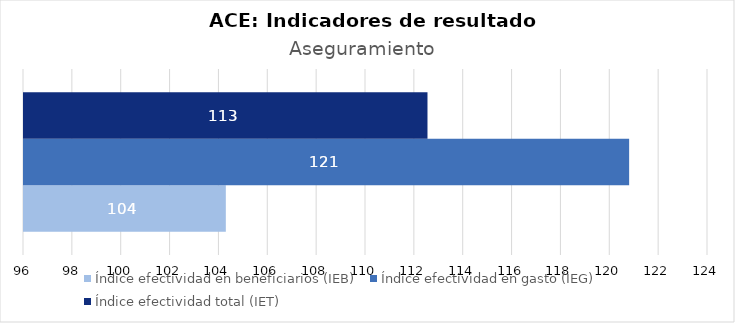
| Category | Índice efectividad en beneficiarios (IEB) | Índice efectividad en gasto (IEG)  | Índice efectividad total (IET) |
|---|---|---|---|
| Aseguramiento | 104.262 | 120.772 | 112.517 |